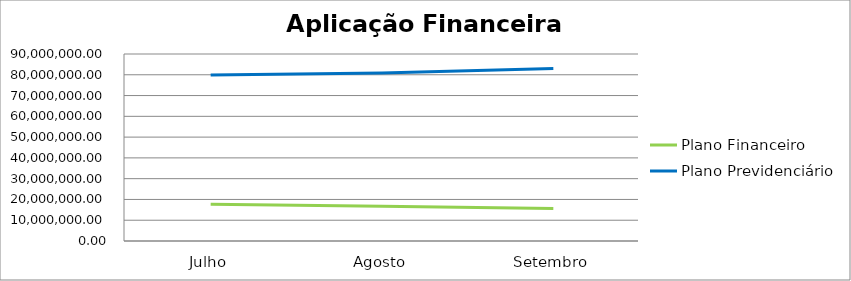
| Category | Plano Financeiro | Plano Previdenciário |
|---|---|---|
| Julho | 17701908.37 | 79876661.89 |
| Agosto | 16689948 | 80848882.34 |
| Setembro | 15689078.6 | 82965907.98 |